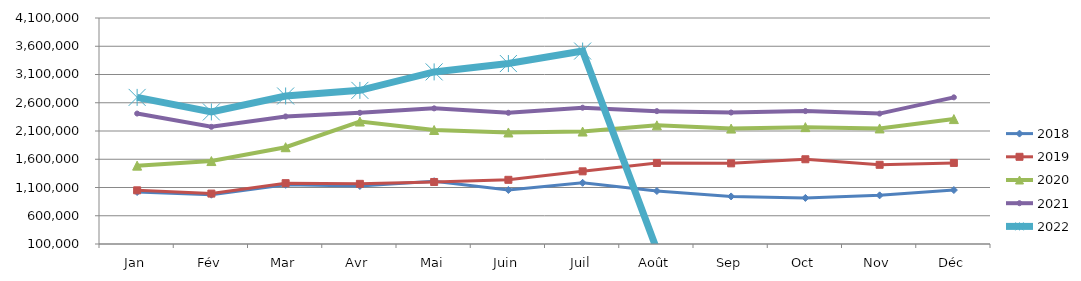
| Category | 2018 | 2019 | 2020 | 2021 | 2022 |
|---|---|---|---|---|---|
| Jan | 1019658.015 | 1050220.805 | 1487095.506 | 2408854.792 | 2694731.985 |
| Fév | 972274.256 | 992184.961 | 1568141.915 | 2173768.196 | 2437594.963 |
| Mar | 1147166.528 | 1176757.88 | 1813146.21 | 2357168.574 | 2719654.074 |
| Avr | 1126714.531 | 1164825.987 | 2267448.511 | 2422161.719 | 2819296.737 |
| Mai | 1212070.878 | 1197851.486 | 2117791.111 | 2500803.422 | 3146053.557 |
| Juin | 1056092.947 | 1235809.908 | 2073858.17 | 2421915.839 | 3293697.406 |
| Juil | 1183060.966 | 1386180.582 | 2090325.728 | 2512181.372 | 3515151.475 |
| Août | 1037606.311 | 1534426.4 | 2199836.197 | 2451614.864 | 0 |
| Sep | 941820.554 | 1527323.009 | 2142727.977 | 2426567.826 | 0 |
| Oct | 915772.772 | 1599889.902 | 2168338.194 | 2452518.375 | 0 |
| Nov | 960817.552 | 1501599.407 | 2145083.497 | 2407792.57 | 0 |
| Déc | 1054685.303 | 1534756.751 | 2310730.947 | 2695648.711 | 0 |